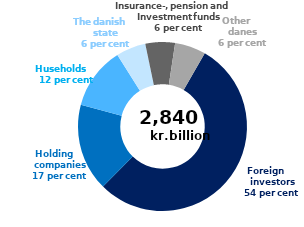
| Category | Series 0 |
|---|---|
| Foreign investors  | 1536.094 |
| Holding companies | 474.543 |
| Households | 337.951 |
| The danish state | 161.582 |
| Insurance, pension and investment funds  | 160.954 |
| Other danes | 168.51 |